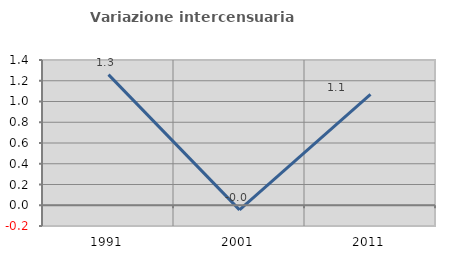
| Category | Variazione intercensuaria annua |
|---|---|
| 1991.0 | 1.259 |
| 2001.0 | -0.044 |
| 2011.0 | 1.069 |